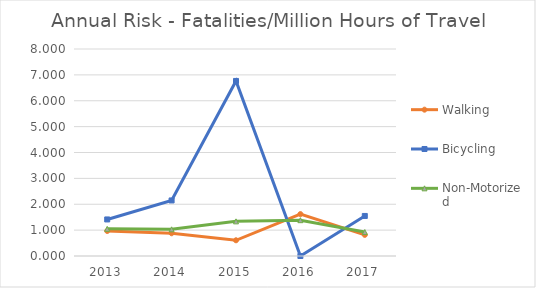
| Category | Walking | Bicycling | Non-Motorized |
|---|---|---|---|
| 2013 | 0.967 | 1.413 | 1.05 |
| 2014 | 0.878 | 2.147 | 1.03 |
| 2015 | 0.607 | 6.765 | 1.338 |
| 2016 | 1.62 | 0 | 1.385 |
| 2017 | 0.816 | 1.547 | 0.926 |